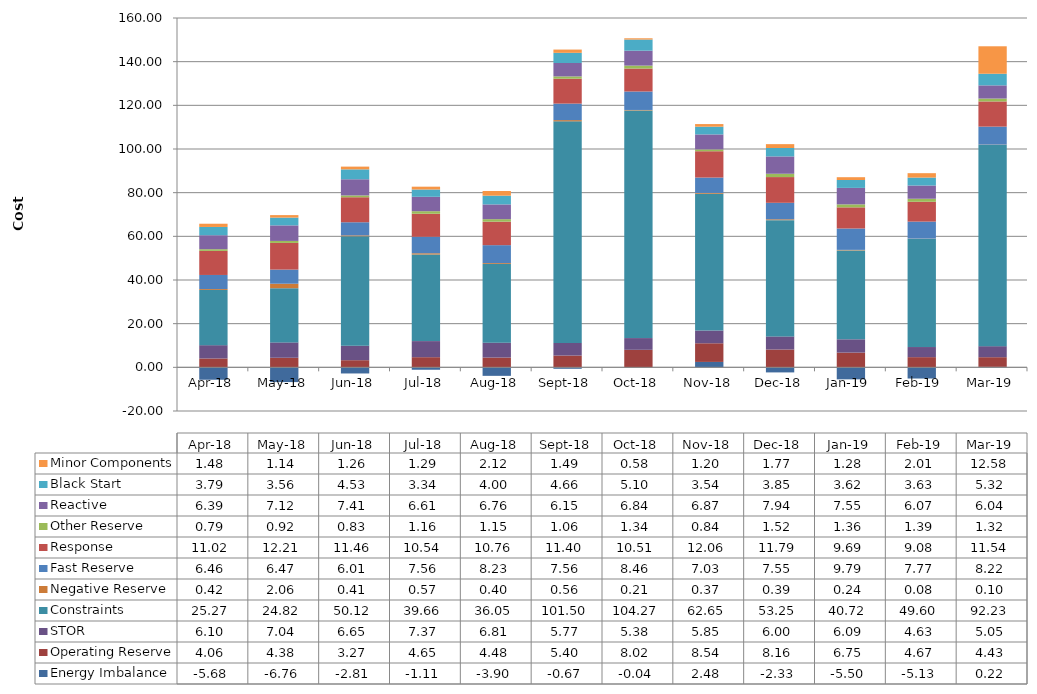
| Category | Energy Imbalance | Operating Reserve | STOR | Constraints | Negative Reserve | Fast Reserve | Response | Other Reserve | Reactive | Black Start | Minor Components |
|---|---|---|---|---|---|---|---|---|---|---|---|
| 2018-04-30 | -5.679 | 4.057 | 6.096 | 25.272 | 0.42 | 6.462 | 11.021 | 0.787 | 6.39 | 3.788 | 1.481 |
| 2018-05-31 | -6.761 | 4.384 | 7.039 | 24.817 | 2.057 | 6.469 | 12.212 | 0.92 | 7.121 | 3.563 | 1.137 |
| 2018-06-30 | -2.81 | 3.267 | 6.649 | 50.116 | 0.408 | 6.008 | 11.46 | 0.826 | 7.407 | 4.53 | 1.263 |
| 2018-07-31 | -1.111 | 4.647 | 7.368 | 39.663 | 0.573 | 7.556 | 10.539 | 1.159 | 6.606 | 3.339 | 1.293 |
| 2018-08-31 | -3.902 | 4.481 | 6.811 | 36.047 | 0.396 | 8.226 | 10.76 | 1.145 | 6.756 | 4.005 | 2.125 |
| 2018-09-30 | -0.669 | 5.398 | 5.771 | 101.503 | 0.564 | 7.556 | 11.398 | 1.055 | 6.149 | 4.659 | 1.488 |
| 2018-10-31 | -0.045 | 8.022 | 5.378 | 104.267 | 0.212 | 8.457 | 10.514 | 1.345 | 6.836 | 5.1 | 0.578 |
| 2018-11-30 | 2.48 | 8.54 | 5.846 | 62.651 | 0.369 | 7.03 | 12.059 | 0.836 | 6.867 | 3.537 | 1.205 |
| 2018-12-31 | -2.327 | 8.159 | 6.005 | 53.253 | 0.389 | 7.55 | 11.787 | 1.518 | 7.944 | 3.846 | 1.774 |
| 2019-01-31 | -5.503 | 6.752 | 6.091 | 40.72 | 0.235 | 9.792 | 9.69 | 1.36 | 7.546 | 3.618 | 1.28 |
| 2019-02-28 | -5.125 | 4.666 | 4.631 | 49.601 | 0.077 | 7.768 | 9.082 | 1.389 | 6.067 | 3.629 | 2.015 |
| 2019-03-31 | 0.216 | 4.427 | 5.053 | 92.229 | 0.104 | 8.215 | 11.545 | 1.32 | 6.036 | 5.323 | 12.581 |